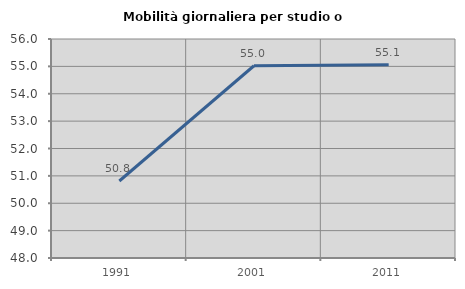
| Category | Mobilità giornaliera per studio o lavoro |
|---|---|
| 1991.0 | 50.813 |
| 2001.0 | 55.022 |
| 2011.0 | 55.06 |